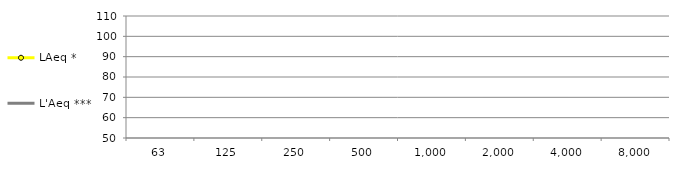
| Category | LAeq * | L'Aeq *** |
|---|---|---|
| 63.0 |  | 0 |
| 125.0 |  | 0 |
| 250.0 |  | 0 |
| 500.0 |  | 0 |
| 1000.0 |  | 0 |
| 2000.0 |  | 0 |
| 4000.0 |  | 0 |
| 8000.0 |  | 0 |